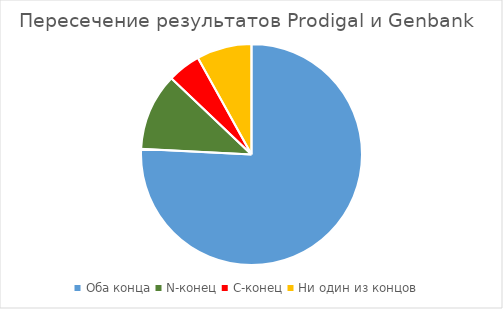
| Category | Series 0 |
|---|---|
| Оба конца | 47 |
| N-конец | 7 |
| C-конец | 3 |
| Ни один из концов | 5 |